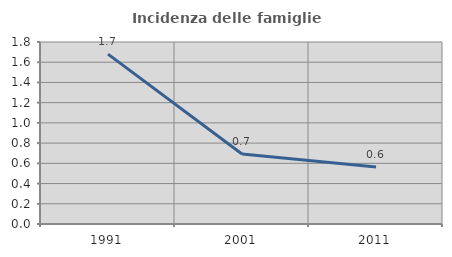
| Category | Incidenza delle famiglie numerose |
|---|---|
| 1991.0 | 1.68 |
| 2001.0 | 0.693 |
| 2011.0 | 0.563 |